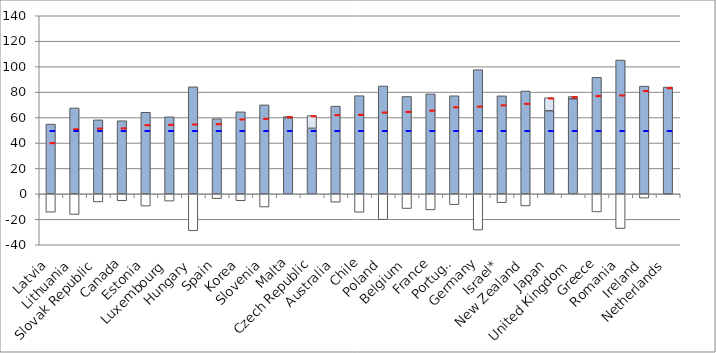
| Category | Gross Earnings | Net taxes | Net transfers |
|---|---|---|---|
| Latvia | 54.864 | -14.422 | 0 |
| Lithuania | 67.56 | -16.214 | 0 |
| Slovak Republic | 58.189 | -6.344 | 0 |
| Canada | 57.499 | -5.45 | 0 |
| Estonia | 64.139 | -9.627 | 0 |
| Luxembourg | 60.564 | -5.705 | 0 |
| Hungary | 84.153 | -29.033 | 0 |
| Spain | 59.098 | -3.785 | 0 |
| Korea | 64.483 | -5.412 | 0 |
| Slovenia | 69.955 | -10.355 | 0 |
| Malta | 59.619 | 0 | 1.172 |
| Czech Republic | 51.51 | 0 | 10.015 |
| Australia | 68.954 | -6.547 | 0 |
| Chile | 77.196 | -14.482 | 0 |
| Poland | 84.79 | -20.305 | 0 |
| Belgium | 76.572 | -11.555 | 0 |
| France | 78.565 | -12.625 | 0 |
| Portugal | 77.123 | -8.483 | 0 |
| Germany | 97.619 | -28.45 | 0 |
| Israel* | 77.066 | -6.936 | 0 |
| New Zealand | 80.865 | -9.499 | 0 |
| Japan | 65.36 | 0 | 10.19 |
| United Kingdom | 74.791 | 0 | 1.728 |
| Greece | 91.617 | -14.201 | 0 |
| Romania | 105.203 | -27.268 | 0 |
| Ireland | 84.705 | -3.35 | 0 |
| Netherlands | 83.992 | -0.321 | 0 |